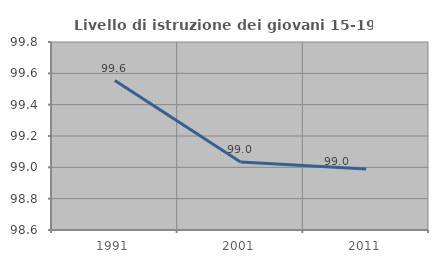
| Category | Livello di istruzione dei giovani 15-19 anni |
|---|---|
| 1991.0 | 99.554 |
| 2001.0 | 99.034 |
| 2011.0 | 98.99 |